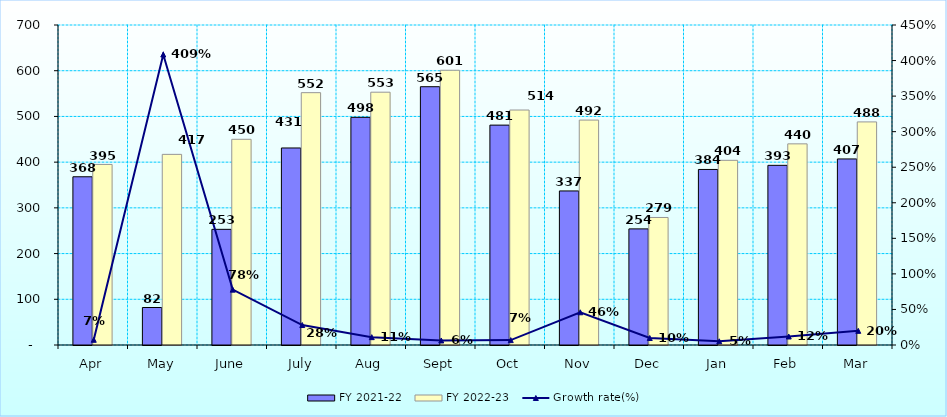
| Category | FY 2021-22 | FY 2022-23 |
|---|---|---|
| Apr | 368 | 395 |
| May | 82 | 417 |
| June | 253 | 450 |
| July | 431 | 552 |
| Aug | 498 | 553 |
| Sept | 565 | 601 |
| Oct | 481 | 514 |
| Nov | 337 | 492 |
| Dec | 254 | 278.962 |
| Jan | 384 | 404 |
| Feb | 393 | 440 |
| Mar | 407 | 488 |